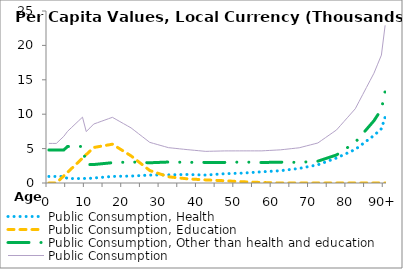
| Category | Public Consumption, Health | Public Consumption, Education | Public Consumption, Other than health and education | Public Consumption |
|---|---|---|---|---|
| 0 | 951.171 | 0 | 4802.337 | 5753.508 |
|  | 951 | 0 | 4801.83 | 5752.829 |
| 2 | 951.171 | 0 | 4801.421 | 5752.592 |
| 3 | 951.065 | 515.8 | 4800.856 | 6267.721 |
| 4 | 951.213 | 1031.6 | 4800.2 | 6783.013 |
| 5 | 649.565 | 1547.4 | 5312.809 | 7509.774 |
| 6 | 649.549 | 2063.201 | 5311.987 | 8024.736 |
| 7 | 649.444 | 2579.001 | 5311.131 | 8539.575 |
| 8 | 649.627 | 3094.801 | 5309.897 | 9054.324 |
| 9 | 649.542 | 3610.601 | 5308.728 | 9568.871 |
| 10 | 664.885 | 4126.401 | 2685.057 | 7476.343 |
| 11 | 680.227 | 4642.201 | 2683.96 | 8006.388 |
| 12 | 726.158 | 5158.001 | 2682.705 | 8566.864 |
| 13 | 772.145 | 5254.101 | 2736.489 | 8762.735 |
| 14 | 818.133 | 5350.2 | 2790.274 | 8958.606 |
| 15 | 864.12 | 5446.299 | 2844.058 | 9154.478 |
| 16 | 910.108 | 5542.398 | 2897.842 | 9350.349 |
| 17 | 956.095 | 5638.498 | 2951.627 | 9546.22 |
| 18 | 967.07 | 5299.623 | 2972.153 | 9238.846 |
| 19 | 978.045 | 4960.748 | 2992.679 | 8931.472 |
| 20 | 989.02 | 4621.873 | 3013.205 | 8624.098 |
| 21 | 999.995 | 4282.998 | 3033.732 | 8316.724 |
| 22 | 1010.97 | 3944.122 | 3054.258 | 8009.35 |
| 23 | 1038.787 | 3518.538 | 3031.637 | 7588.962 |
| 24 | 1066.603 | 3092.954 | 3009.016 | 7168.573 |
| 25 | 1094.42 | 2667.369 | 2986.395 | 6748.185 |
| 26 | 1122.237 | 2241.785 | 2963.775 | 6327.796 |
| 27 | 1150.054 | 1816.2 | 2941.154 | 5907.407 |
| 28 | 1157.267 | 1633.868 | 2962.441 | 5753.575 |
| 29 | 1164.48 | 1451.536 | 2983.728 | 5599.743 |
| 30 | 1171.693 | 1269.204 | 3005.015 | 5445.911 |
| 31 | 1178.906 | 1086.871 | 3026.302 | 5292.079 |
| 32 | 1186.119 | 904.539 | 3047.589 | 5138.247 |
| 33 | 1196.261 | 845.786 | 3038.976 | 5081.023 |
| 34 | 1206.403 | 787.032 | 3030.363 | 5023.798 |
| 35 | 1216.546 | 728.278 | 3021.75 | 4966.574 |
| 36 | 1226.688 | 669.525 | 3013.137 | 4909.349 |
| 37 | 1236.83 | 610.771 | 3004.524 | 4852.125 |
| 38 | 1220.473 | 578.403 | 3002.405 | 4801.281 |
| 39 | 1204.117 | 546.034 | 3000.286 | 4750.437 |
| 40 | 1187.761 | 513.666 | 2998.167 | 4699.593 |
| 41 | 1171.405 | 481.297 | 2996.048 | 4648.75 |
| 42 | 1155.048 | 448.929 | 2993.929 | 4597.906 |
| 43 | 1193.396 | 425.211 | 2992.472 | 4611.078 |
| 44 | 1231.743 | 401.493 | 2991.015 | 4624.25 |
| 45 | 1270.09 | 377.774 | 2989.558 | 4637.423 |
| 46 | 1308.437 | 354.056 | 2988.102 | 4650.595 |
| 47 | 1346.785 | 330.338 | 2986.645 | 4663.768 |
| 48 | 1365.618 | 299.553 | 2999.962 | 4665.133 |
| 49 | 1384.451 | 268.768 | 3013.279 | 4666.498 |
| 50 | 1403.284 | 237.984 | 3026.597 | 4667.864 |
| 51 | 1422.116 | 207.199 | 3039.914 | 4669.229 |
| 52 | 1440.949 | 176.414 | 3053.232 | 4670.595 |
| 53 | 1478.238 | 154.926 | 3037.585 | 4670.749 |
| 54 | 1515.526 | 133.438 | 3021.939 | 4670.903 |
| 55 | 1552.815 | 111.95 | 3006.293 | 4671.058 |
| 56 | 1590.103 | 90.462 | 2990.647 | 4671.212 |
| 57 | 1627.392 | 68.974 | 2975 | 4671.366 |
| 58 | 1659.262 | 55.179 | 2986.691 | 4701.132 |
| 59 | 1691.132 | 41.385 | 2998.382 | 4730.898 |
| 60 | 1723.002 | 27.59 | 3010.073 | 4760.665 |
| 61 | 1754.872 | 13.795 | 3021.764 | 4790.431 |
| 62 | 1786.742 | 0 | 3033.455 | 4820.197 |
| 63 | 1854.108 | 0 | 3025.773 | 4879.881 |
| 64 | 1921.474 | 0 | 3018.09 | 4939.564 |
| 65 | 1988.84 | 0 | 3010.408 | 4999.248 |
| 66 | 2056.206 | 0 | 3002.725 | 5058.931 |
| 67 | 2123.572 | 0 | 2995.043 | 5118.615 |
| 68 | 2228.124 | 0 | 3030.471 | 5258.595 |
| 69 | 2332.676 | 0 | 3065.899 | 5398.575 |
| 70 | 2437.228 | 0 | 3101.328 | 5538.556 |
| 71 | 2541.78 | 0 | 3136.756 | 5678.536 |
| 72 | 2646.332 | 0 | 3172.184 | 5818.516 |
| 73 | 2844.349 | 0 | 3353.685 | 6198.034 |
| 74 | 3042.366 | 0 | 3535.186 | 6577.551 |
| 75 | 3240.382 | 0 | 3716.686 | 6957.069 |
| 76 | 3438.399 | 0 | 3898.187 | 7336.586 |
| 77 | 3636.416 | 0 | 4079.688 | 7716.104 |
| 78 | 3884.487 | 0 | 4445.463 | 8329.95 |
| 79 | 4132.558 | 0 | 4811.238 | 8943.796 |
| 80 | 4380.629 | 0 | 5177.013 | 9557.643 |
| 81 | 4628.7 | 0 | 5542.788 | 10171.489 |
| 82 | 4876.771 | 0 | 5908.564 | 10785.335 |
| 83 | 5282.861 | 0 | 6535.573 | 11818.434 |
| 84 | 5688.951 | 0 | 7162.582 | 12851.532 |
| 85 | 6095.041 | 0 | 7789.591 | 13884.631 |
| 86 | 6501.13 | 0 | 8416.6 | 14917.73 |
| 87 | 6907.22 | 0 | 9043.609 | 15950.829 |
| 88 | 7396.33 | 0 | 9874.056 | 17270.385 |
| 89 | 7885.44 | 0 | 10704.503 | 18589.942 |
| 90+ | 9576.221 | 0 | 13339.265 | 22915.485 |